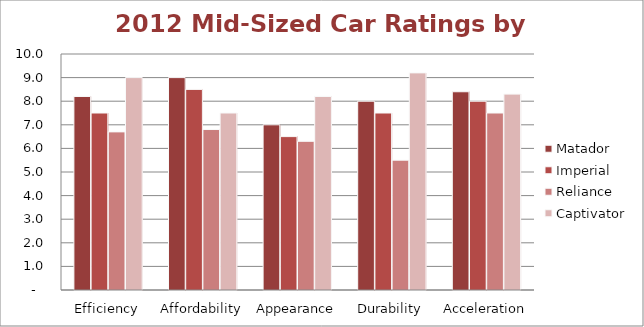
| Category | Matador | Imperial | Reliance | Captivator |
|---|---|---|---|---|
| Efficiency | 8.2 | 7.5 | 6.7 | 9 |
| Affordability | 9 | 8.5 | 6.8 | 7.5 |
| Appearance | 7 | 6.5 | 6.3 | 8.2 |
| Durability | 8 | 7.5 | 5.5 | 9.2 |
| Acceleration | 8.4 | 8 | 7.5 | 8.3 |